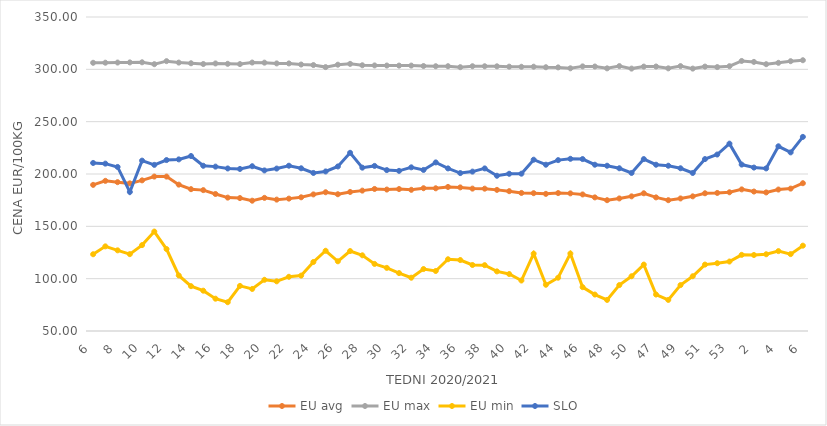
| Category | EU avg | EU max | EU min | SLO |
|---|---|---|---|---|
| 6.0 | 189.621 | 306.25 | 123.326 | 210.53 |
| 7.0 | 193.453 | 306.33 | 130.863 | 209.91 |
| 8.0 | 192.201 | 306.48 | 127.071 | 206.73 |
| 9.0 | 191.052 | 306.62 | 123.433 | 182.84 |
| 10.0 | 193.933 | 306.73 | 132.064 | 212.78 |
| 11.0 | 197.552 | 304.92 | 145.006 | 208.73 |
| 12.0 | 197.533 | 307.82 | 128.293 | 213.32 |
| 13.0 | 189.839 | 306.44 | 103.04 | 213.96 |
| 14.0 | 185.504 | 305.8 | 92.836 | 217.19 |
| 15.0 | 184.591 | 305.08 | 88.508 | 207.87 |
| 16.0 | 180.892 | 305.63 | 80.873 | 207.05 |
| 17.0 | 177.437 | 305.27 | 77.506 | 205.29 |
| 18.0 | 176.995 | 305.01 | 93.104 | 204.82 |
| 19.0 | 174.49 | 306.49 | 90.169 | 207.44 |
| 20.0 | 177.204 | 306.38 | 98.928 | 203.41 |
| 21.0 | 175.519 | 305.66 | 97.454 | 205.19 |
| 22.0 | 176.473 | 305.64 | 101.792 | 207.91 |
| 23.0 | 177.741 | 304.59 | 102.918 | 205.46 |
| 24.0 | 180.501 | 304.1 | 115.936 | 201 |
| 25.0 | 182.568 | 302.13 | 126.655 | 202.43 |
| 26.0 | 180.667 | 304.43 | 116.597 | 207.19 |
| 27.0 | 182.833 | 305.22 | 126.397 | 220.25 |
| 28.0 | 184.121 | 303.88 | 122.317 | 206.06 |
| 29.0 | 185.712 | 303.73 | 114.082 | 207.73 |
| 30.0 | 185.141 | 303.63 | 110.314 | 203.73 |
| 31.0 | 185.621 | 303.57 | 105.336 | 203 |
| 32.0 | 184.887 | 303.58 | 100.908 | 206.36 |
| 33.0 | 186.411 | 303.17 | 109.191 | 203.88 |
| 34.0 | 186.338 | 302.96 | 107.355 | 211.07 |
| 35.0 | 187.628 | 302.99 | 118.534 | 205.34 |
| 36.0 | 187.19 | 302.05 | 117.814 | 200.88 |
| 37.0 | 186.038 | 302.98 | 113.058 | 202.29 |
| 38.0 | 185.986 | 302.94 | 112.896 | 205.33 |
| 39.0 | 184.836 | 302.88 | 106.953 | 198.33 |
| 40.0 | 183.595 | 302.56 | 104.426 | 200.21 |
| 41.0 | 181.893 | 302.44 | 98.23 | 200.3 |
| 42.0 | 181.671 | 302.52 | 123.908 | 213.66 |
| 43.0 | 181.023 | 302.01 | 94.177 | 208.86 |
| 44.0 | 181.795 | 301.86 | 100.908 | 213.25 |
| 45.0 | 181.489 | 300.98 | 124 | 214.51 |
| 46.0 | 180.473 | 302.82 | 91.889 | 214.27 |
| 47.0 | 177.656 | 302.7 | 84.832 | 208.87 |
| 48.0 | 174.977 | 300.94 | 79.697 | 207.9 |
| 49.0 | 176.65 | 303.09 | 93.873 | 205.48 |
| 50.0 | 178.648 | 300.7 | 102.316 | 200.99 |
| 51.0 | 181.58 | 302.62 | 113.46 | 214.25 |
| 47.0 | 177.656 | 302.7 | 84.832 | 208.87 |
| 48.0 | 174.977 | 300.94 | 79.697 | 207.9 |
| 49.0 | 176.65 | 303.09 | 93.873 | 205.48 |
| 50.0 | 178.648 | 300.7 | 102.316 | 200.99 |
| 51.0 | 181.58 | 302.62 | 113.46 | 214.25 |
| 52.0 | 181.9 | 302.14 | 114.76 | 218.61 |
| 53.0 | 182.536 | 303 | 116.375 | 229 |
| 1.0 | 185.3 | 308 | 122.769 | 209 |
| 2.0 | 183.25 | 307.1 | 122.609 | 206.15 |
| 3.0 | 182.393 | 304.91 | 123.32 | 205.35 |
| 4.0 | 185.158 | 306.22 | 126.329 | 226.48 |
| 5.0 | 186.04 | 307.79 | 123.461 | 220.65 |
| 6.0 | 191.206 | 308.7 | 131.528 | 235.46 |